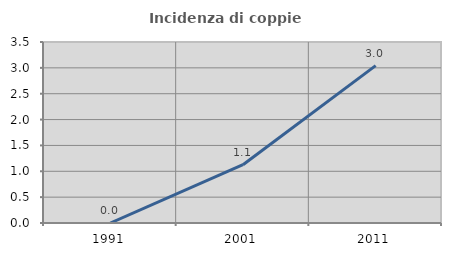
| Category | Incidenza di coppie miste |
|---|---|
| 1991.0 | 0 |
| 2001.0 | 1.128 |
| 2011.0 | 3.043 |